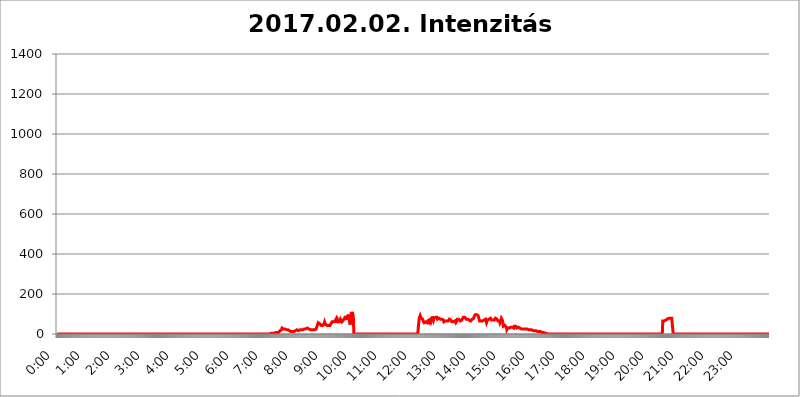
| Category | 2017.02.02. Intenzitás [W/m^2] |
|---|---|
| 0.0 | 0 |
| 0.0006944444444444445 | 0 |
| 0.001388888888888889 | 0 |
| 0.0020833333333333333 | 0 |
| 0.002777777777777778 | 0 |
| 0.003472222222222222 | 0 |
| 0.004166666666666667 | 0 |
| 0.004861111111111111 | 0 |
| 0.005555555555555556 | 0 |
| 0.0062499999999999995 | 0 |
| 0.006944444444444444 | 0 |
| 0.007638888888888889 | 0 |
| 0.008333333333333333 | 0 |
| 0.009027777777777779 | 0 |
| 0.009722222222222222 | 0 |
| 0.010416666666666666 | 0 |
| 0.011111111111111112 | 0 |
| 0.011805555555555555 | 0 |
| 0.012499999999999999 | 0 |
| 0.013194444444444444 | 0 |
| 0.013888888888888888 | 0 |
| 0.014583333333333332 | 0 |
| 0.015277777777777777 | 0 |
| 0.015972222222222224 | 0 |
| 0.016666666666666666 | 0 |
| 0.017361111111111112 | 0 |
| 0.018055555555555557 | 0 |
| 0.01875 | 0 |
| 0.019444444444444445 | 0 |
| 0.02013888888888889 | 0 |
| 0.020833333333333332 | 0 |
| 0.02152777777777778 | 0 |
| 0.022222222222222223 | 0 |
| 0.02291666666666667 | 0 |
| 0.02361111111111111 | 0 |
| 0.024305555555555556 | 0 |
| 0.024999999999999998 | 0 |
| 0.025694444444444447 | 0 |
| 0.02638888888888889 | 0 |
| 0.027083333333333334 | 0 |
| 0.027777777777777776 | 0 |
| 0.02847222222222222 | 0 |
| 0.029166666666666664 | 0 |
| 0.029861111111111113 | 0 |
| 0.030555555555555555 | 0 |
| 0.03125 | 0 |
| 0.03194444444444445 | 0 |
| 0.03263888888888889 | 0 |
| 0.03333333333333333 | 0 |
| 0.034027777777777775 | 0 |
| 0.034722222222222224 | 0 |
| 0.035416666666666666 | 0 |
| 0.036111111111111115 | 0 |
| 0.03680555555555556 | 0 |
| 0.0375 | 0 |
| 0.03819444444444444 | 0 |
| 0.03888888888888889 | 0 |
| 0.03958333333333333 | 0 |
| 0.04027777777777778 | 0 |
| 0.04097222222222222 | 0 |
| 0.041666666666666664 | 0 |
| 0.042361111111111106 | 0 |
| 0.04305555555555556 | 0 |
| 0.043750000000000004 | 0 |
| 0.044444444444444446 | 0 |
| 0.04513888888888889 | 0 |
| 0.04583333333333334 | 0 |
| 0.04652777777777778 | 0 |
| 0.04722222222222222 | 0 |
| 0.04791666666666666 | 0 |
| 0.04861111111111111 | 0 |
| 0.049305555555555554 | 0 |
| 0.049999999999999996 | 0 |
| 0.05069444444444445 | 0 |
| 0.051388888888888894 | 0 |
| 0.052083333333333336 | 0 |
| 0.05277777777777778 | 0 |
| 0.05347222222222222 | 0 |
| 0.05416666666666667 | 0 |
| 0.05486111111111111 | 0 |
| 0.05555555555555555 | 0 |
| 0.05625 | 0 |
| 0.05694444444444444 | 0 |
| 0.057638888888888885 | 0 |
| 0.05833333333333333 | 0 |
| 0.05902777777777778 | 0 |
| 0.059722222222222225 | 0 |
| 0.06041666666666667 | 0 |
| 0.061111111111111116 | 0 |
| 0.06180555555555556 | 0 |
| 0.0625 | 0 |
| 0.06319444444444444 | 0 |
| 0.06388888888888888 | 0 |
| 0.06458333333333334 | 0 |
| 0.06527777777777778 | 0 |
| 0.06597222222222222 | 0 |
| 0.06666666666666667 | 0 |
| 0.06736111111111111 | 0 |
| 0.06805555555555555 | 0 |
| 0.06874999999999999 | 0 |
| 0.06944444444444443 | 0 |
| 0.07013888888888889 | 0 |
| 0.07083333333333333 | 0 |
| 0.07152777777777779 | 0 |
| 0.07222222222222223 | 0 |
| 0.07291666666666667 | 0 |
| 0.07361111111111111 | 0 |
| 0.07430555555555556 | 0 |
| 0.075 | 0 |
| 0.07569444444444444 | 0 |
| 0.0763888888888889 | 0 |
| 0.07708333333333334 | 0 |
| 0.07777777777777778 | 0 |
| 0.07847222222222222 | 0 |
| 0.07916666666666666 | 0 |
| 0.0798611111111111 | 0 |
| 0.08055555555555556 | 0 |
| 0.08125 | 0 |
| 0.08194444444444444 | 0 |
| 0.08263888888888889 | 0 |
| 0.08333333333333333 | 0 |
| 0.08402777777777777 | 0 |
| 0.08472222222222221 | 0 |
| 0.08541666666666665 | 0 |
| 0.08611111111111112 | 0 |
| 0.08680555555555557 | 0 |
| 0.08750000000000001 | 0 |
| 0.08819444444444445 | 0 |
| 0.08888888888888889 | 0 |
| 0.08958333333333333 | 0 |
| 0.09027777777777778 | 0 |
| 0.09097222222222222 | 0 |
| 0.09166666666666667 | 0 |
| 0.09236111111111112 | 0 |
| 0.09305555555555556 | 0 |
| 0.09375 | 0 |
| 0.09444444444444444 | 0 |
| 0.09513888888888888 | 0 |
| 0.09583333333333333 | 0 |
| 0.09652777777777777 | 0 |
| 0.09722222222222222 | 0 |
| 0.09791666666666667 | 0 |
| 0.09861111111111111 | 0 |
| 0.09930555555555555 | 0 |
| 0.09999999999999999 | 0 |
| 0.10069444444444443 | 0 |
| 0.1013888888888889 | 0 |
| 0.10208333333333335 | 0 |
| 0.10277777777777779 | 0 |
| 0.10347222222222223 | 0 |
| 0.10416666666666667 | 0 |
| 0.10486111111111111 | 0 |
| 0.10555555555555556 | 0 |
| 0.10625 | 0 |
| 0.10694444444444444 | 0 |
| 0.1076388888888889 | 0 |
| 0.10833333333333334 | 0 |
| 0.10902777777777778 | 0 |
| 0.10972222222222222 | 0 |
| 0.1111111111111111 | 0 |
| 0.11180555555555556 | 0 |
| 0.11180555555555556 | 0 |
| 0.1125 | 0 |
| 0.11319444444444444 | 0 |
| 0.11388888888888889 | 0 |
| 0.11458333333333333 | 0 |
| 0.11527777777777777 | 0 |
| 0.11597222222222221 | 0 |
| 0.11666666666666665 | 0 |
| 0.1173611111111111 | 0 |
| 0.11805555555555557 | 0 |
| 0.11944444444444445 | 0 |
| 0.12013888888888889 | 0 |
| 0.12083333333333333 | 0 |
| 0.12152777777777778 | 0 |
| 0.12222222222222223 | 0 |
| 0.12291666666666667 | 0 |
| 0.12291666666666667 | 0 |
| 0.12361111111111112 | 0 |
| 0.12430555555555556 | 0 |
| 0.125 | 0 |
| 0.12569444444444444 | 0 |
| 0.12638888888888888 | 0 |
| 0.12708333333333333 | 0 |
| 0.16875 | 0 |
| 0.12847222222222224 | 0 |
| 0.12916666666666668 | 0 |
| 0.12986111111111112 | 0 |
| 0.13055555555555556 | 0 |
| 0.13125 | 0 |
| 0.13194444444444445 | 0 |
| 0.1326388888888889 | 0 |
| 0.13333333333333333 | 0 |
| 0.13402777777777777 | 0 |
| 0.13402777777777777 | 0 |
| 0.13472222222222222 | 0 |
| 0.13541666666666666 | 0 |
| 0.1361111111111111 | 0 |
| 0.13749999999999998 | 0 |
| 0.13819444444444443 | 0 |
| 0.1388888888888889 | 0 |
| 0.13958333333333334 | 0 |
| 0.14027777777777778 | 0 |
| 0.14097222222222222 | 0 |
| 0.14166666666666666 | 0 |
| 0.1423611111111111 | 0 |
| 0.14305555555555557 | 0 |
| 0.14375000000000002 | 0 |
| 0.14444444444444446 | 0 |
| 0.1451388888888889 | 0 |
| 0.1451388888888889 | 0 |
| 0.14652777777777778 | 0 |
| 0.14722222222222223 | 0 |
| 0.14791666666666667 | 0 |
| 0.1486111111111111 | 0 |
| 0.14930555555555555 | 0 |
| 0.15 | 0 |
| 0.15069444444444444 | 0 |
| 0.15138888888888888 | 0 |
| 0.15208333333333332 | 0 |
| 0.15277777777777776 | 0 |
| 0.15347222222222223 | 0 |
| 0.15416666666666667 | 0 |
| 0.15486111111111112 | 0 |
| 0.15555555555555556 | 0 |
| 0.15625 | 0 |
| 0.15694444444444444 | 0 |
| 0.15763888888888888 | 0 |
| 0.15833333333333333 | 0 |
| 0.15902777777777777 | 0 |
| 0.15972222222222224 | 0 |
| 0.16041666666666668 | 0 |
| 0.16111111111111112 | 0 |
| 0.16180555555555556 | 0 |
| 0.1625 | 0 |
| 0.16319444444444445 | 0 |
| 0.1638888888888889 | 0 |
| 0.16458333333333333 | 0 |
| 0.16527777777777777 | 0 |
| 0.16597222222222222 | 0 |
| 0.16666666666666666 | 0 |
| 0.1673611111111111 | 0 |
| 0.16805555555555554 | 0 |
| 0.16874999999999998 | 0 |
| 0.16944444444444443 | 0 |
| 0.17013888888888887 | 0 |
| 0.1708333333333333 | 0 |
| 0.17152777777777775 | 0 |
| 0.17222222222222225 | 0 |
| 0.1729166666666667 | 0 |
| 0.17361111111111113 | 0 |
| 0.17430555555555557 | 0 |
| 0.17500000000000002 | 0 |
| 0.17569444444444446 | 0 |
| 0.1763888888888889 | 0 |
| 0.17708333333333334 | 0 |
| 0.17777777777777778 | 0 |
| 0.17847222222222223 | 0 |
| 0.17916666666666667 | 0 |
| 0.1798611111111111 | 0 |
| 0.18055555555555555 | 0 |
| 0.18125 | 0 |
| 0.18194444444444444 | 0 |
| 0.1826388888888889 | 0 |
| 0.18333333333333335 | 0 |
| 0.1840277777777778 | 0 |
| 0.18472222222222223 | 0 |
| 0.18541666666666667 | 0 |
| 0.18611111111111112 | 0 |
| 0.18680555555555556 | 0 |
| 0.1875 | 0 |
| 0.18819444444444444 | 0 |
| 0.18888888888888888 | 0 |
| 0.18958333333333333 | 0 |
| 0.19027777777777777 | 0 |
| 0.1909722222222222 | 0 |
| 0.19166666666666665 | 0 |
| 0.19236111111111112 | 0 |
| 0.19305555555555554 | 0 |
| 0.19375 | 0 |
| 0.19444444444444445 | 0 |
| 0.1951388888888889 | 0 |
| 0.19583333333333333 | 0 |
| 0.19652777777777777 | 0 |
| 0.19722222222222222 | 0 |
| 0.19791666666666666 | 0 |
| 0.1986111111111111 | 0 |
| 0.19930555555555554 | 0 |
| 0.19999999999999998 | 0 |
| 0.20069444444444443 | 0 |
| 0.20138888888888887 | 0 |
| 0.2020833333333333 | 0 |
| 0.2027777777777778 | 0 |
| 0.2034722222222222 | 0 |
| 0.2041666666666667 | 0 |
| 0.20486111111111113 | 0 |
| 0.20555555555555557 | 0 |
| 0.20625000000000002 | 0 |
| 0.20694444444444446 | 0 |
| 0.2076388888888889 | 0 |
| 0.20833333333333334 | 0 |
| 0.20902777777777778 | 0 |
| 0.20972222222222223 | 0 |
| 0.21041666666666667 | 0 |
| 0.2111111111111111 | 0 |
| 0.21180555555555555 | 0 |
| 0.2125 | 0 |
| 0.21319444444444444 | 0 |
| 0.2138888888888889 | 0 |
| 0.21458333333333335 | 0 |
| 0.2152777777777778 | 0 |
| 0.21597222222222223 | 0 |
| 0.21666666666666667 | 0 |
| 0.21736111111111112 | 0 |
| 0.21805555555555556 | 0 |
| 0.21875 | 0 |
| 0.21944444444444444 | 0 |
| 0.22013888888888888 | 0 |
| 0.22083333333333333 | 0 |
| 0.22152777777777777 | 0 |
| 0.2222222222222222 | 0 |
| 0.22291666666666665 | 0 |
| 0.2236111111111111 | 0 |
| 0.22430555555555556 | 0 |
| 0.225 | 0 |
| 0.22569444444444445 | 0 |
| 0.2263888888888889 | 0 |
| 0.22708333333333333 | 0 |
| 0.22777777777777777 | 0 |
| 0.22847222222222222 | 0 |
| 0.22916666666666666 | 0 |
| 0.2298611111111111 | 0 |
| 0.23055555555555554 | 0 |
| 0.23124999999999998 | 0 |
| 0.23194444444444443 | 0 |
| 0.23263888888888887 | 0 |
| 0.2333333333333333 | 0 |
| 0.2340277777777778 | 0 |
| 0.2347222222222222 | 0 |
| 0.2354166666666667 | 0 |
| 0.23611111111111113 | 0 |
| 0.23680555555555557 | 0 |
| 0.23750000000000002 | 0 |
| 0.23819444444444446 | 0 |
| 0.2388888888888889 | 0 |
| 0.23958333333333334 | 0 |
| 0.24027777777777778 | 0 |
| 0.24097222222222223 | 0 |
| 0.24166666666666667 | 0 |
| 0.2423611111111111 | 0 |
| 0.24305555555555555 | 0 |
| 0.24375 | 0 |
| 0.24444444444444446 | 0 |
| 0.24513888888888888 | 0 |
| 0.24583333333333335 | 0 |
| 0.2465277777777778 | 0 |
| 0.24722222222222223 | 0 |
| 0.24791666666666667 | 0 |
| 0.24861111111111112 | 0 |
| 0.24930555555555556 | 0 |
| 0.25 | 0 |
| 0.25069444444444444 | 0 |
| 0.2513888888888889 | 0 |
| 0.2520833333333333 | 0 |
| 0.25277777777777777 | 0 |
| 0.2534722222222222 | 0 |
| 0.25416666666666665 | 0 |
| 0.2548611111111111 | 0 |
| 0.2555555555555556 | 0 |
| 0.25625000000000003 | 0 |
| 0.2569444444444445 | 0 |
| 0.2576388888888889 | 0 |
| 0.25833333333333336 | 0 |
| 0.2590277777777778 | 0 |
| 0.25972222222222224 | 0 |
| 0.2604166666666667 | 0 |
| 0.2611111111111111 | 0 |
| 0.26180555555555557 | 0 |
| 0.2625 | 0 |
| 0.26319444444444445 | 0 |
| 0.2638888888888889 | 0 |
| 0.26458333333333334 | 0 |
| 0.2652777777777778 | 0 |
| 0.2659722222222222 | 0 |
| 0.26666666666666666 | 0 |
| 0.2673611111111111 | 0 |
| 0.26805555555555555 | 0 |
| 0.26875 | 0 |
| 0.26944444444444443 | 0 |
| 0.2701388888888889 | 0 |
| 0.2708333333333333 | 0 |
| 0.27152777777777776 | 0 |
| 0.2722222222222222 | 0 |
| 0.27291666666666664 | 0 |
| 0.2736111111111111 | 0 |
| 0.2743055555555555 | 0 |
| 0.27499999999999997 | 0 |
| 0.27569444444444446 | 0 |
| 0.27638888888888885 | 0 |
| 0.27708333333333335 | 0 |
| 0.2777777777777778 | 0 |
| 0.27847222222222223 | 0 |
| 0.2791666666666667 | 0 |
| 0.2798611111111111 | 0 |
| 0.28055555555555556 | 0 |
| 0.28125 | 0 |
| 0.28194444444444444 | 0 |
| 0.2826388888888889 | 0 |
| 0.2833333333333333 | 0 |
| 0.28402777777777777 | 0 |
| 0.2847222222222222 | 0 |
| 0.28541666666666665 | 0 |
| 0.28611111111111115 | 0 |
| 0.28680555555555554 | 0 |
| 0.28750000000000003 | 0 |
| 0.2881944444444445 | 0 |
| 0.2888888888888889 | 0 |
| 0.28958333333333336 | 0 |
| 0.2902777777777778 | 0 |
| 0.29097222222222224 | 0 |
| 0.2916666666666667 | 0 |
| 0.2923611111111111 | 0 |
| 0.29305555555555557 | 0 |
| 0.29375 | 0 |
| 0.29444444444444445 | 0 |
| 0.2951388888888889 | 0 |
| 0.29583333333333334 | 0 |
| 0.2965277777777778 | 3.525 |
| 0.2972222222222222 | 0 |
| 0.29791666666666666 | 0 |
| 0.2986111111111111 | 3.525 |
| 0.29930555555555555 | 3.525 |
| 0.3 | 3.525 |
| 0.30069444444444443 | 3.525 |
| 0.3013888888888889 | 3.525 |
| 0.3020833333333333 | 3.525 |
| 0.30277777777777776 | 3.525 |
| 0.3034722222222222 | 3.525 |
| 0.30416666666666664 | 3.525 |
| 0.3048611111111111 | 3.525 |
| 0.3055555555555555 | 3.525 |
| 0.30624999999999997 | 7.887 |
| 0.3069444444444444 | 7.887 |
| 0.3076388888888889 | 7.887 |
| 0.30833333333333335 | 7.887 |
| 0.3090277777777778 | 7.887 |
| 0.30972222222222223 | 7.887 |
| 0.3104166666666667 | 7.887 |
| 0.3111111111111111 | 12.257 |
| 0.31180555555555556 | 12.257 |
| 0.3125 | 16.636 |
| 0.31319444444444444 | 16.636 |
| 0.3138888888888889 | 21.024 |
| 0.3145833333333333 | 21.024 |
| 0.31527777777777777 | 29.823 |
| 0.3159722222222222 | 29.823 |
| 0.31666666666666665 | 25.419 |
| 0.31736111111111115 | 25.419 |
| 0.31805555555555554 | 25.419 |
| 0.31875000000000003 | 25.419 |
| 0.3194444444444445 | 25.419 |
| 0.3201388888888889 | 21.024 |
| 0.32083333333333336 | 21.024 |
| 0.3215277777777778 | 21.024 |
| 0.32222222222222224 | 21.024 |
| 0.3229166666666667 | 21.024 |
| 0.3236111111111111 | 21.024 |
| 0.32430555555555557 | 16.636 |
| 0.325 | 16.636 |
| 0.32569444444444445 | 16.636 |
| 0.3263888888888889 | 12.257 |
| 0.32708333333333334 | 12.257 |
| 0.3277777777777778 | 12.257 |
| 0.3284722222222222 | 12.257 |
| 0.32916666666666666 | 12.257 |
| 0.3298611111111111 | 12.257 |
| 0.33055555555555555 | 12.257 |
| 0.33125 | 12.257 |
| 0.33194444444444443 | 12.257 |
| 0.3326388888888889 | 12.257 |
| 0.3333333333333333 | 12.257 |
| 0.3340277777777778 | 16.636 |
| 0.3347222222222222 | 16.636 |
| 0.3354166666666667 | 16.636 |
| 0.3361111111111111 | 21.024 |
| 0.3368055555555556 | 16.636 |
| 0.33749999999999997 | 16.636 |
| 0.33819444444444446 | 16.636 |
| 0.33888888888888885 | 16.636 |
| 0.33958333333333335 | 21.024 |
| 0.34027777777777773 | 21.024 |
| 0.34097222222222223 | 25.419 |
| 0.3416666666666666 | 21.024 |
| 0.3423611111111111 | 21.024 |
| 0.3430555555555555 | 21.024 |
| 0.34375 | 21.024 |
| 0.3444444444444445 | 21.024 |
| 0.3451388888888889 | 21.024 |
| 0.3458333333333334 | 21.024 |
| 0.34652777777777777 | 25.419 |
| 0.34722222222222227 | 25.419 |
| 0.34791666666666665 | 25.419 |
| 0.34861111111111115 | 25.419 |
| 0.34930555555555554 | 29.823 |
| 0.35000000000000003 | 29.823 |
| 0.3506944444444444 | 29.823 |
| 0.3513888888888889 | 25.419 |
| 0.3520833333333333 | 25.419 |
| 0.3527777777777778 | 25.419 |
| 0.3534722222222222 | 25.419 |
| 0.3541666666666667 | 21.024 |
| 0.3548611111111111 | 21.024 |
| 0.35555555555555557 | 21.024 |
| 0.35625 | 21.024 |
| 0.35694444444444445 | 21.024 |
| 0.3576388888888889 | 21.024 |
| 0.35833333333333334 | 21.024 |
| 0.3590277777777778 | 21.024 |
| 0.3597222222222222 | 21.024 |
| 0.36041666666666666 | 21.024 |
| 0.3611111111111111 | 21.024 |
| 0.36180555555555555 | 25.419 |
| 0.3625 | 25.419 |
| 0.36319444444444443 | 25.419 |
| 0.3638888888888889 | 34.234 |
| 0.3645833333333333 | 38.653 |
| 0.3652777777777778 | 38.653 |
| 0.3659722222222222 | 56.398 |
| 0.3666666666666667 | 51.951 |
| 0.3673611111111111 | 51.951 |
| 0.3680555555555556 | 51.951 |
| 0.36874999999999997 | 47.511 |
| 0.36944444444444446 | 51.951 |
| 0.37013888888888885 | 43.079 |
| 0.37083333333333335 | 47.511 |
| 0.37152777777777773 | 47.511 |
| 0.37222222222222223 | 43.079 |
| 0.3729166666666666 | 47.511 |
| 0.3736111111111111 | 47.511 |
| 0.3743055555555555 | 51.951 |
| 0.375 | 60.85 |
| 0.3756944444444445 | 56.398 |
| 0.3763888888888889 | 47.511 |
| 0.3770833333333334 | 43.079 |
| 0.37777777777777777 | 43.079 |
| 0.37847222222222227 | 43.079 |
| 0.37916666666666665 | 43.079 |
| 0.37986111111111115 | 43.079 |
| 0.38055555555555554 | 43.079 |
| 0.38125000000000003 | 47.511 |
| 0.3819444444444444 | 47.511 |
| 0.3826388888888889 | 43.079 |
| 0.3833333333333333 | 47.511 |
| 0.3840277777777778 | 51.951 |
| 0.3847222222222222 | 56.398 |
| 0.3854166666666667 | 60.85 |
| 0.3861111111111111 | 65.31 |
| 0.38680555555555557 | 65.31 |
| 0.3875 | 60.85 |
| 0.38819444444444445 | 56.398 |
| 0.3888888888888889 | 56.398 |
| 0.38958333333333334 | 65.31 |
| 0.3902777777777778 | 60.85 |
| 0.3909722222222222 | 74.246 |
| 0.39166666666666666 | 56.398 |
| 0.3923611111111111 | 51.951 |
| 0.39305555555555555 | 69.775 |
| 0.39375 | 60.85 |
| 0.39444444444444443 | 60.85 |
| 0.3951388888888889 | 60.85 |
| 0.3958333333333333 | 60.85 |
| 0.3965277777777778 | 65.31 |
| 0.3972222222222222 | 74.246 |
| 0.3979166666666667 | 74.246 |
| 0.3986111111111111 | 69.775 |
| 0.3993055555555556 | 60.85 |
| 0.39999999999999997 | 60.85 |
| 0.40069444444444446 | 65.31 |
| 0.40138888888888885 | 69.775 |
| 0.40208333333333335 | 74.246 |
| 0.40277777777777773 | 74.246 |
| 0.40347222222222223 | 83.205 |
| 0.4041666666666666 | 78.722 |
| 0.4048611111111111 | 87.692 |
| 0.4055555555555555 | 83.205 |
| 0.40625 | 69.775 |
| 0.4069444444444445 | 92.184 |
| 0.4076388888888889 | 78.722 |
| 0.4083333333333334 | 96.682 |
| 0.40902777777777777 | 92.184 |
| 0.40972222222222227 | 74.246 |
| 0.41041666666666665 | 47.511 |
| 0.41111111111111115 | 56.398 |
| 0.41180555555555554 | 83.205 |
| 0.41250000000000003 | 110.201 |
| 0.4131944444444444 | 92.184 |
| 0.4138888888888889 | 110.201 |
| 0.4145833333333333 | 96.682 |
| 0.4152777777777778 | 87.692 |
| 0.4159722222222222 | 0 |
| 0.4166666666666667 | 0 |
| 0.4173611111111111 | 0 |
| 0.41805555555555557 | 0 |
| 0.41875 | 0 |
| 0.41944444444444445 | 0 |
| 0.4201388888888889 | 0 |
| 0.42083333333333334 | 0 |
| 0.4215277777777778 | 0 |
| 0.4222222222222222 | 0 |
| 0.42291666666666666 | 0 |
| 0.4236111111111111 | 0 |
| 0.42430555555555555 | 0 |
| 0.425 | 0 |
| 0.42569444444444443 | 0 |
| 0.4263888888888889 | 0 |
| 0.4270833333333333 | 0 |
| 0.4277777777777778 | 0 |
| 0.4284722222222222 | 0 |
| 0.4291666666666667 | 0 |
| 0.4298611111111111 | 0 |
| 0.4305555555555556 | 0 |
| 0.43124999999999997 | 0 |
| 0.43194444444444446 | 0 |
| 0.43263888888888885 | 0 |
| 0.43333333333333335 | 0 |
| 0.43402777777777773 | 0 |
| 0.43472222222222223 | 0 |
| 0.4354166666666666 | 0 |
| 0.4361111111111111 | 0 |
| 0.4368055555555555 | 0 |
| 0.4375 | 0 |
| 0.4381944444444445 | 0 |
| 0.4388888888888889 | 0 |
| 0.4395833333333334 | 0 |
| 0.44027777777777777 | 0 |
| 0.44097222222222227 | 0 |
| 0.44166666666666665 | 0 |
| 0.44236111111111115 | 0 |
| 0.44305555555555554 | 0 |
| 0.44375000000000003 | 0 |
| 0.4444444444444444 | 0 |
| 0.4451388888888889 | 0 |
| 0.4458333333333333 | 0 |
| 0.4465277777777778 | 0 |
| 0.4472222222222222 | 0 |
| 0.4479166666666667 | 0 |
| 0.4486111111111111 | 0 |
| 0.44930555555555557 | 0 |
| 0.45 | 0 |
| 0.45069444444444445 | 0 |
| 0.4513888888888889 | 0 |
| 0.45208333333333334 | 0 |
| 0.4527777777777778 | 0 |
| 0.4534722222222222 | 0 |
| 0.45416666666666666 | 0 |
| 0.4548611111111111 | 0 |
| 0.45555555555555555 | 0 |
| 0.45625 | 0 |
| 0.45694444444444443 | 0 |
| 0.4576388888888889 | 0 |
| 0.4583333333333333 | 0 |
| 0.4590277777777778 | 0 |
| 0.4597222222222222 | 0 |
| 0.4604166666666667 | 0 |
| 0.4611111111111111 | 0 |
| 0.4618055555555556 | 0 |
| 0.46249999999999997 | 0 |
| 0.46319444444444446 | 0 |
| 0.46388888888888885 | 0 |
| 0.46458333333333335 | 0 |
| 0.46527777777777773 | 0 |
| 0.46597222222222223 | 0 |
| 0.4666666666666666 | 0 |
| 0.4673611111111111 | 0 |
| 0.4680555555555555 | 0 |
| 0.46875 | 0 |
| 0.4694444444444445 | 0 |
| 0.4701388888888889 | 0 |
| 0.4708333333333334 | 0 |
| 0.47152777777777777 | 0 |
| 0.47222222222222227 | 0 |
| 0.47291666666666665 | 0 |
| 0.47361111111111115 | 0 |
| 0.47430555555555554 | 0 |
| 0.47500000000000003 | 0 |
| 0.4756944444444444 | 0 |
| 0.4763888888888889 | 0 |
| 0.4770833333333333 | 0 |
| 0.4777777777777778 | 0 |
| 0.4784722222222222 | 0 |
| 0.4791666666666667 | 0 |
| 0.4798611111111111 | 0 |
| 0.48055555555555557 | 0 |
| 0.48125 | 0 |
| 0.48194444444444445 | 0 |
| 0.4826388888888889 | 0 |
| 0.48333333333333334 | 0 |
| 0.4840277777777778 | 0 |
| 0.4847222222222222 | 0 |
| 0.48541666666666666 | 0 |
| 0.4861111111111111 | 0 |
| 0.48680555555555555 | 0 |
| 0.4875 | 0 |
| 0.48819444444444443 | 0 |
| 0.4888888888888889 | 0 |
| 0.4895833333333333 | 0 |
| 0.4902777777777778 | 0 |
| 0.4909722222222222 | 0 |
| 0.4916666666666667 | 0 |
| 0.4923611111111111 | 0 |
| 0.4930555555555556 | 0 |
| 0.49374999999999997 | 0 |
| 0.49444444444444446 | 0 |
| 0.49513888888888885 | 0 |
| 0.49583333333333335 | 0 |
| 0.49652777777777773 | 0 |
| 0.49722222222222223 | 0 |
| 0.4979166666666666 | 0 |
| 0.4986111111111111 | 0 |
| 0.4993055555555555 | 0 |
| 0.5 | 0 |
| 0.5006944444444444 | 0 |
| 0.5013888888888889 | 0 |
| 0.5020833333333333 | 0 |
| 0.5027777777777778 | 0 |
| 0.5034722222222222 | 0 |
| 0.5041666666666667 | 0 |
| 0.5048611111111111 | 0 |
| 0.5055555555555555 | 0 |
| 0.50625 | 0 |
| 0.5069444444444444 | 0 |
| 0.5076388888888889 | 78.722 |
| 0.5083333333333333 | 78.722 |
| 0.5090277777777777 | 92.184 |
| 0.5097222222222222 | 87.692 |
| 0.5104166666666666 | 78.722 |
| 0.5111111111111112 | 74.246 |
| 0.5118055555555555 | 74.246 |
| 0.5125000000000001 | 74.246 |
| 0.5131944444444444 | 65.31 |
| 0.513888888888889 | 60.85 |
| 0.5145833333333333 | 56.398 |
| 0.5152777777777778 | 56.398 |
| 0.5159722222222222 | 56.398 |
| 0.5166666666666667 | 60.85 |
| 0.517361111111111 | 60.85 |
| 0.5180555555555556 | 60.85 |
| 0.5187499999999999 | 56.398 |
| 0.5194444444444445 | 65.31 |
| 0.5201388888888888 | 69.775 |
| 0.5208333333333334 | 65.31 |
| 0.5215277777777778 | 69.775 |
| 0.5222222222222223 | 60.85 |
| 0.5229166666666667 | 65.31 |
| 0.5236111111111111 | 69.775 |
| 0.5243055555555556 | 60.85 |
| 0.525 | 65.31 |
| 0.5256944444444445 | 74.246 |
| 0.5263888888888889 | 87.692 |
| 0.5270833333333333 | 78.722 |
| 0.5277777777777778 | 69.775 |
| 0.5284722222222222 | 78.722 |
| 0.5291666666666667 | 74.246 |
| 0.5298611111111111 | 83.205 |
| 0.5305555555555556 | 83.205 |
| 0.53125 | 83.205 |
| 0.5319444444444444 | 87.692 |
| 0.5326388888888889 | 83.205 |
| 0.5333333333333333 | 74.246 |
| 0.5340277777777778 | 74.246 |
| 0.5347222222222222 | 78.722 |
| 0.5354166666666667 | 78.722 |
| 0.5361111111111111 | 74.246 |
| 0.5368055555555555 | 74.246 |
| 0.5375 | 74.246 |
| 0.5381944444444444 | 69.775 |
| 0.5388888888888889 | 74.246 |
| 0.5395833333333333 | 74.246 |
| 0.5402777777777777 | 78.722 |
| 0.5409722222222222 | 74.246 |
| 0.5416666666666666 | 69.775 |
| 0.5423611111111112 | 60.85 |
| 0.5430555555555555 | 60.85 |
| 0.5437500000000001 | 65.31 |
| 0.5444444444444444 | 65.31 |
| 0.545138888888889 | 60.85 |
| 0.5458333333333333 | 65.31 |
| 0.5465277777777778 | 65.31 |
| 0.5472222222222222 | 60.85 |
| 0.5479166666666667 | 60.85 |
| 0.548611111111111 | 65.31 |
| 0.5493055555555556 | 65.31 |
| 0.5499999999999999 | 74.246 |
| 0.5506944444444445 | 74.246 |
| 0.5513888888888888 | 74.246 |
| 0.5520833333333334 | 69.775 |
| 0.5527777777777778 | 65.31 |
| 0.5534722222222223 | 60.85 |
| 0.5541666666666667 | 56.398 |
| 0.5548611111111111 | 56.398 |
| 0.5555555555555556 | 60.85 |
| 0.55625 | 60.85 |
| 0.5569444444444445 | 65.31 |
| 0.5576388888888889 | 65.31 |
| 0.5583333333333333 | 60.85 |
| 0.5590277777777778 | 56.398 |
| 0.5597222222222222 | 56.398 |
| 0.5604166666666667 | 65.31 |
| 0.5611111111111111 | 74.246 |
| 0.5618055555555556 | 74.246 |
| 0.5625 | 74.246 |
| 0.5631944444444444 | 74.246 |
| 0.5638888888888889 | 74.246 |
| 0.5645833333333333 | 69.775 |
| 0.5652777777777778 | 65.31 |
| 0.5659722222222222 | 65.31 |
| 0.5666666666666667 | 69.775 |
| 0.5673611111111111 | 69.775 |
| 0.5680555555555555 | 65.31 |
| 0.56875 | 74.246 |
| 0.5694444444444444 | 83.205 |
| 0.5701388888888889 | 78.722 |
| 0.5708333333333333 | 78.722 |
| 0.5715277777777777 | 83.205 |
| 0.5722222222222222 | 83.205 |
| 0.5729166666666666 | 83.205 |
| 0.5736111111111112 | 74.246 |
| 0.5743055555555555 | 74.246 |
| 0.5750000000000001 | 74.246 |
| 0.5756944444444444 | 74.246 |
| 0.576388888888889 | 74.246 |
| 0.5770833333333333 | 69.775 |
| 0.5777777777777778 | 69.775 |
| 0.5784722222222222 | 69.775 |
| 0.5791666666666667 | 65.31 |
| 0.579861111111111 | 65.31 |
| 0.5805555555555556 | 65.31 |
| 0.5812499999999999 | 69.775 |
| 0.5819444444444445 | 74.246 |
| 0.5826388888888888 | 74.246 |
| 0.5833333333333334 | 74.246 |
| 0.5840277777777778 | 78.722 |
| 0.5847222222222223 | 87.692 |
| 0.5854166666666667 | 92.184 |
| 0.5861111111111111 | 96.682 |
| 0.5868055555555556 | 96.682 |
| 0.5875 | 96.682 |
| 0.5881944444444445 | 96.682 |
| 0.5888888888888889 | 92.184 |
| 0.5895833333333333 | 92.184 |
| 0.5902777777777778 | 92.184 |
| 0.5909722222222222 | 87.692 |
| 0.5916666666666667 | 74.246 |
| 0.5923611111111111 | 65.31 |
| 0.5930555555555556 | 65.31 |
| 0.59375 | 60.85 |
| 0.5944444444444444 | 65.31 |
| 0.5951388888888889 | 65.31 |
| 0.5958333333333333 | 65.31 |
| 0.5965277777777778 | 65.31 |
| 0.5972222222222222 | 69.775 |
| 0.5979166666666667 | 69.775 |
| 0.5986111111111111 | 69.775 |
| 0.5993055555555555 | 69.775 |
| 0.6 | 74.246 |
| 0.6006944444444444 | 74.246 |
| 0.6013888888888889 | 65.31 |
| 0.6020833333333333 | 56.398 |
| 0.6027777777777777 | 60.85 |
| 0.6034722222222222 | 69.775 |
| 0.6041666666666666 | 74.246 |
| 0.6048611111111112 | 74.246 |
| 0.6055555555555555 | 74.246 |
| 0.6062500000000001 | 74.246 |
| 0.6069444444444444 | 78.722 |
| 0.607638888888889 | 78.722 |
| 0.6083333333333333 | 74.246 |
| 0.6090277777777778 | 69.775 |
| 0.6097222222222222 | 65.31 |
| 0.6104166666666667 | 69.775 |
| 0.611111111111111 | 69.775 |
| 0.6118055555555556 | 69.775 |
| 0.6124999999999999 | 69.775 |
| 0.6131944444444445 | 69.775 |
| 0.6138888888888888 | 74.246 |
| 0.6145833333333334 | 78.722 |
| 0.6152777777777778 | 78.722 |
| 0.6159722222222223 | 78.722 |
| 0.6166666666666667 | 74.246 |
| 0.6173611111111111 | 74.246 |
| 0.6180555555555556 | 65.31 |
| 0.61875 | 65.31 |
| 0.6194444444444445 | 69.775 |
| 0.6201388888888889 | 65.31 |
| 0.6208333333333333 | 56.398 |
| 0.6215277777777778 | 56.398 |
| 0.6222222222222222 | 69.775 |
| 0.6229166666666667 | 78.722 |
| 0.6236111111111111 | 74.246 |
| 0.6243055555555556 | 69.775 |
| 0.625 | 56.398 |
| 0.6256944444444444 | 38.653 |
| 0.6263888888888889 | 34.234 |
| 0.6270833333333333 | 38.653 |
| 0.6277777777777778 | 43.079 |
| 0.6284722222222222 | 38.653 |
| 0.6291666666666667 | 38.653 |
| 0.6298611111111111 | 34.234 |
| 0.6305555555555555 | 21.024 |
| 0.63125 | 21.024 |
| 0.6319444444444444 | 29.823 |
| 0.6326388888888889 | 29.823 |
| 0.6333333333333333 | 29.823 |
| 0.6340277777777777 | 29.823 |
| 0.6347222222222222 | 25.419 |
| 0.6354166666666666 | 29.823 |
| 0.6361111111111112 | 34.234 |
| 0.6368055555555555 | 38.653 |
| 0.6375000000000001 | 38.653 |
| 0.6381944444444444 | 34.234 |
| 0.638888888888889 | 29.823 |
| 0.6395833333333333 | 29.823 |
| 0.6402777777777778 | 29.823 |
| 0.6409722222222222 | 38.653 |
| 0.6416666666666667 | 38.653 |
| 0.642361111111111 | 38.653 |
| 0.6430555555555556 | 38.653 |
| 0.6437499999999999 | 34.234 |
| 0.6444444444444445 | 29.823 |
| 0.6451388888888888 | 29.823 |
| 0.6458333333333334 | 29.823 |
| 0.6465277777777778 | 34.234 |
| 0.6472222222222223 | 29.823 |
| 0.6479166666666667 | 29.823 |
| 0.6486111111111111 | 29.823 |
| 0.6493055555555556 | 29.823 |
| 0.65 | 25.419 |
| 0.6506944444444445 | 25.419 |
| 0.6513888888888889 | 25.419 |
| 0.6520833333333333 | 25.419 |
| 0.6527777777777778 | 25.419 |
| 0.6534722222222222 | 25.419 |
| 0.6541666666666667 | 25.419 |
| 0.6548611111111111 | 25.419 |
| 0.6555555555555556 | 25.419 |
| 0.65625 | 25.419 |
| 0.6569444444444444 | 25.419 |
| 0.6576388888888889 | 25.419 |
| 0.6583333333333333 | 25.419 |
| 0.6590277777777778 | 25.419 |
| 0.6597222222222222 | 25.419 |
| 0.6604166666666667 | 21.024 |
| 0.6611111111111111 | 21.024 |
| 0.6618055555555555 | 21.024 |
| 0.6625 | 21.024 |
| 0.6631944444444444 | 21.024 |
| 0.6638888888888889 | 21.024 |
| 0.6645833333333333 | 21.024 |
| 0.6652777777777777 | 21.024 |
| 0.6659722222222222 | 21.024 |
| 0.6666666666666666 | 16.636 |
| 0.6673611111111111 | 16.636 |
| 0.6680555555555556 | 16.636 |
| 0.6687500000000001 | 16.636 |
| 0.6694444444444444 | 16.636 |
| 0.6701388888888888 | 16.636 |
| 0.6708333333333334 | 16.636 |
| 0.6715277777777778 | 16.636 |
| 0.6722222222222222 | 16.636 |
| 0.6729166666666666 | 16.636 |
| 0.6736111111111112 | 12.257 |
| 0.6743055555555556 | 12.257 |
| 0.6749999999999999 | 12.257 |
| 0.6756944444444444 | 12.257 |
| 0.6763888888888889 | 12.257 |
| 0.6770833333333334 | 12.257 |
| 0.6777777777777777 | 12.257 |
| 0.6784722222222223 | 7.887 |
| 0.6791666666666667 | 7.887 |
| 0.6798611111111111 | 7.887 |
| 0.6805555555555555 | 7.887 |
| 0.68125 | 7.887 |
| 0.6819444444444445 | 7.887 |
| 0.6826388888888889 | 3.525 |
| 0.6833333333333332 | 3.525 |
| 0.6840277777777778 | 3.525 |
| 0.6847222222222222 | 3.525 |
| 0.6854166666666667 | 3.525 |
| 0.686111111111111 | 3.525 |
| 0.6868055555555556 | 3.525 |
| 0.6875 | 0 |
| 0.6881944444444444 | 0 |
| 0.688888888888889 | 0 |
| 0.6895833333333333 | 0 |
| 0.6902777777777778 | 0 |
| 0.6909722222222222 | 0 |
| 0.6916666666666668 | 0 |
| 0.6923611111111111 | 0 |
| 0.6930555555555555 | 0 |
| 0.69375 | 0 |
| 0.6944444444444445 | 0 |
| 0.6951388888888889 | 0 |
| 0.6958333333333333 | 0 |
| 0.6965277777777777 | 0 |
| 0.6972222222222223 | 0 |
| 0.6979166666666666 | 0 |
| 0.6986111111111111 | 0 |
| 0.6993055555555556 | 0 |
| 0.7000000000000001 | 0 |
| 0.7006944444444444 | 0 |
| 0.7013888888888888 | 0 |
| 0.7020833333333334 | 0 |
| 0.7027777777777778 | 0 |
| 0.7034722222222222 | 0 |
| 0.7041666666666666 | 0 |
| 0.7048611111111112 | 0 |
| 0.7055555555555556 | 0 |
| 0.7062499999999999 | 0 |
| 0.7069444444444444 | 0 |
| 0.7076388888888889 | 0 |
| 0.7083333333333334 | 0 |
| 0.7090277777777777 | 0 |
| 0.7097222222222223 | 0 |
| 0.7104166666666667 | 0 |
| 0.7111111111111111 | 0 |
| 0.7118055555555555 | 0 |
| 0.7125 | 0 |
| 0.7131944444444445 | 0 |
| 0.7138888888888889 | 0 |
| 0.7145833333333332 | 0 |
| 0.7152777777777778 | 0 |
| 0.7159722222222222 | 0 |
| 0.7166666666666667 | 0 |
| 0.717361111111111 | 0 |
| 0.7180555555555556 | 0 |
| 0.71875 | 0 |
| 0.7194444444444444 | 0 |
| 0.720138888888889 | 0 |
| 0.7208333333333333 | 0 |
| 0.7215277777777778 | 0 |
| 0.7222222222222222 | 0 |
| 0.7229166666666668 | 0 |
| 0.7236111111111111 | 0 |
| 0.7243055555555555 | 0 |
| 0.725 | 0 |
| 0.7256944444444445 | 0 |
| 0.7263888888888889 | 0 |
| 0.7270833333333333 | 0 |
| 0.7277777777777777 | 0 |
| 0.7284722222222223 | 0 |
| 0.7291666666666666 | 0 |
| 0.7298611111111111 | 0 |
| 0.7305555555555556 | 0 |
| 0.7312500000000001 | 0 |
| 0.7319444444444444 | 0 |
| 0.7326388888888888 | 0 |
| 0.7333333333333334 | 0 |
| 0.7340277777777778 | 0 |
| 0.7347222222222222 | 0 |
| 0.7354166666666666 | 0 |
| 0.7361111111111112 | 0 |
| 0.7368055555555556 | 0 |
| 0.7374999999999999 | 0 |
| 0.7381944444444444 | 0 |
| 0.7388888888888889 | 0 |
| 0.7395833333333334 | 0 |
| 0.7402777777777777 | 0 |
| 0.7409722222222223 | 0 |
| 0.7416666666666667 | 0 |
| 0.7423611111111111 | 0 |
| 0.7430555555555555 | 0 |
| 0.74375 | 0 |
| 0.7444444444444445 | 0 |
| 0.7451388888888889 | 0 |
| 0.7458333333333332 | 0 |
| 0.7465277777777778 | 0 |
| 0.7472222222222222 | 0 |
| 0.7479166666666667 | 0 |
| 0.748611111111111 | 0 |
| 0.7493055555555556 | 0 |
| 0.75 | 0 |
| 0.7506944444444444 | 0 |
| 0.751388888888889 | 0 |
| 0.7520833333333333 | 0 |
| 0.7527777777777778 | 0 |
| 0.7534722222222222 | 0 |
| 0.7541666666666668 | 0 |
| 0.7548611111111111 | 0 |
| 0.7555555555555555 | 0 |
| 0.75625 | 0 |
| 0.7569444444444445 | 0 |
| 0.7576388888888889 | 0 |
| 0.7583333333333333 | 0 |
| 0.7590277777777777 | 0 |
| 0.7597222222222223 | 0 |
| 0.7604166666666666 | 0 |
| 0.7611111111111111 | 0 |
| 0.7618055555555556 | 0 |
| 0.7625000000000001 | 0 |
| 0.7631944444444444 | 0 |
| 0.7638888888888888 | 0 |
| 0.7645833333333334 | 0 |
| 0.7652777777777778 | 0 |
| 0.7659722222222222 | 0 |
| 0.7666666666666666 | 0 |
| 0.7673611111111112 | 0 |
| 0.7680555555555556 | 0 |
| 0.7687499999999999 | 0 |
| 0.7694444444444444 | 0 |
| 0.7701388888888889 | 0 |
| 0.7708333333333334 | 0 |
| 0.7715277777777777 | 0 |
| 0.7722222222222223 | 0 |
| 0.7729166666666667 | 0 |
| 0.7736111111111111 | 0 |
| 0.7743055555555555 | 0 |
| 0.775 | 0 |
| 0.7756944444444445 | 0 |
| 0.7763888888888889 | 0 |
| 0.7770833333333332 | 0 |
| 0.7777777777777778 | 0 |
| 0.7784722222222222 | 0 |
| 0.7791666666666667 | 0 |
| 0.779861111111111 | 0 |
| 0.7805555555555556 | 0 |
| 0.78125 | 0 |
| 0.7819444444444444 | 0 |
| 0.782638888888889 | 0 |
| 0.7833333333333333 | 0 |
| 0.7840277777777778 | 0 |
| 0.7847222222222222 | 0 |
| 0.7854166666666668 | 0 |
| 0.7861111111111111 | 0 |
| 0.7868055555555555 | 0 |
| 0.7875 | 0 |
| 0.7881944444444445 | 0 |
| 0.7888888888888889 | 0 |
| 0.7895833333333333 | 0 |
| 0.7902777777777777 | 0 |
| 0.7909722222222223 | 0 |
| 0.7916666666666666 | 0 |
| 0.7923611111111111 | 0 |
| 0.7930555555555556 | 0 |
| 0.7937500000000001 | 0 |
| 0.7944444444444444 | 0 |
| 0.7951388888888888 | 0 |
| 0.7958333333333334 | 0 |
| 0.7965277777777778 | 0 |
| 0.7972222222222222 | 0 |
| 0.7979166666666666 | 0 |
| 0.7986111111111112 | 0 |
| 0.7993055555555556 | 0 |
| 0.7999999999999999 | 0 |
| 0.8006944444444444 | 0 |
| 0.8013888888888889 | 0 |
| 0.8020833333333334 | 0 |
| 0.8027777777777777 | 0 |
| 0.8034722222222223 | 0 |
| 0.8041666666666667 | 0 |
| 0.8048611111111111 | 0 |
| 0.8055555555555555 | 0 |
| 0.80625 | 0 |
| 0.8069444444444445 | 0 |
| 0.8076388888888889 | 0 |
| 0.8083333333333332 | 0 |
| 0.8090277777777778 | 0 |
| 0.8097222222222222 | 0 |
| 0.8104166666666667 | 0 |
| 0.811111111111111 | 0 |
| 0.8118055555555556 | 0 |
| 0.8125 | 0 |
| 0.8131944444444444 | 0 |
| 0.813888888888889 | 0 |
| 0.8145833333333333 | 0 |
| 0.8152777777777778 | 0 |
| 0.8159722222222222 | 0 |
| 0.8166666666666668 | 0 |
| 0.8173611111111111 | 0 |
| 0.8180555555555555 | 0 |
| 0.81875 | 0 |
| 0.8194444444444445 | 0 |
| 0.8201388888888889 | 0 |
| 0.8208333333333333 | 0 |
| 0.8215277777777777 | 0 |
| 0.8222222222222223 | 0 |
| 0.8229166666666666 | 0 |
| 0.8236111111111111 | 0 |
| 0.8243055555555556 | 0 |
| 0.8250000000000001 | 0 |
| 0.8256944444444444 | 0 |
| 0.8263888888888888 | 0 |
| 0.8270833333333334 | 0 |
| 0.8277777777777778 | 0 |
| 0.8284722222222222 | 0 |
| 0.8291666666666666 | 0 |
| 0.8298611111111112 | 0 |
| 0.8305555555555556 | 0 |
| 0.8312499999999999 | 0 |
| 0.8319444444444444 | 0 |
| 0.8326388888888889 | 0 |
| 0.8333333333333334 | 0 |
| 0.8340277777777777 | 0 |
| 0.8347222222222223 | 0 |
| 0.8354166666666667 | 0 |
| 0.8361111111111111 | 0 |
| 0.8368055555555555 | 0 |
| 0.8375 | 0 |
| 0.8381944444444445 | 0 |
| 0.8388888888888889 | 0 |
| 0.8395833333333332 | 0 |
| 0.8402777777777778 | 0 |
| 0.8409722222222222 | 0 |
| 0.8416666666666667 | 0 |
| 0.842361111111111 | 0 |
| 0.8430555555555556 | 0 |
| 0.84375 | 0 |
| 0.8444444444444444 | 0 |
| 0.845138888888889 | 0 |
| 0.8458333333333333 | 0 |
| 0.8465277777777778 | 0 |
| 0.8472222222222222 | 0 |
| 0.8479166666666668 | 0 |
| 0.8486111111111111 | 0 |
| 0.8493055555555555 | 65.31 |
| 0.85 | 65.31 |
| 0.8506944444444445 | 65.31 |
| 0.8513888888888889 | 65.31 |
| 0.8520833333333333 | 65.31 |
| 0.8527777777777777 | 65.31 |
| 0.8534722222222223 | 69.775 |
| 0.8541666666666666 | 69.775 |
| 0.8548611111111111 | 74.246 |
| 0.8555555555555556 | 74.246 |
| 0.8562500000000001 | 74.246 |
| 0.8569444444444444 | 74.246 |
| 0.8576388888888888 | 78.722 |
| 0.8583333333333334 | 78.722 |
| 0.8590277777777778 | 78.722 |
| 0.8597222222222222 | 78.722 |
| 0.8604166666666666 | 78.722 |
| 0.8611111111111112 | 78.722 |
| 0.8618055555555556 | 78.722 |
| 0.8624999999999999 | 78.722 |
| 0.8631944444444444 | 83.205 |
| 0.8638888888888889 | 0 |
| 0.8645833333333334 | 0 |
| 0.8652777777777777 | 0 |
| 0.8659722222222223 | 0 |
| 0.8666666666666667 | 0 |
| 0.8673611111111111 | 0 |
| 0.8680555555555555 | 0 |
| 0.86875 | 0 |
| 0.8694444444444445 | 0 |
| 0.8701388888888889 | 0 |
| 0.8708333333333332 | 0 |
| 0.8715277777777778 | 0 |
| 0.8722222222222222 | 0 |
| 0.8729166666666667 | 0 |
| 0.873611111111111 | 0 |
| 0.8743055555555556 | 0 |
| 0.875 | 0 |
| 0.8756944444444444 | 0 |
| 0.876388888888889 | 0 |
| 0.8770833333333333 | 0 |
| 0.8777777777777778 | 0 |
| 0.8784722222222222 | 0 |
| 0.8791666666666668 | 0 |
| 0.8798611111111111 | 0 |
| 0.8805555555555555 | 0 |
| 0.88125 | 0 |
| 0.8819444444444445 | 0 |
| 0.8826388888888889 | 0 |
| 0.8833333333333333 | 0 |
| 0.8840277777777777 | 0 |
| 0.8847222222222223 | 0 |
| 0.8854166666666666 | 0 |
| 0.8861111111111111 | 0 |
| 0.8868055555555556 | 0 |
| 0.8875000000000001 | 0 |
| 0.8881944444444444 | 0 |
| 0.8888888888888888 | 0 |
| 0.8895833333333334 | 0 |
| 0.8902777777777778 | 0 |
| 0.8909722222222222 | 0 |
| 0.8916666666666666 | 0 |
| 0.8923611111111112 | 0 |
| 0.8930555555555556 | 0 |
| 0.8937499999999999 | 0 |
| 0.8944444444444444 | 0 |
| 0.8951388888888889 | 0 |
| 0.8958333333333334 | 0 |
| 0.8965277777777777 | 0 |
| 0.8972222222222223 | 0 |
| 0.8979166666666667 | 0 |
| 0.8986111111111111 | 0 |
| 0.8993055555555555 | 0 |
| 0.9 | 0 |
| 0.9006944444444445 | 0 |
| 0.9013888888888889 | 0 |
| 0.9020833333333332 | 0 |
| 0.9027777777777778 | 0 |
| 0.9034722222222222 | 0 |
| 0.9041666666666667 | 0 |
| 0.904861111111111 | 0 |
| 0.9055555555555556 | 0 |
| 0.90625 | 0 |
| 0.9069444444444444 | 0 |
| 0.907638888888889 | 0 |
| 0.9083333333333333 | 0 |
| 0.9090277777777778 | 0 |
| 0.9097222222222222 | 0 |
| 0.9104166666666668 | 0 |
| 0.9111111111111111 | 0 |
| 0.9118055555555555 | 0 |
| 0.9125 | 0 |
| 0.9131944444444445 | 0 |
| 0.9138888888888889 | 0 |
| 0.9145833333333333 | 0 |
| 0.9152777777777777 | 0 |
| 0.9159722222222223 | 0 |
| 0.9166666666666666 | 0 |
| 0.9173611111111111 | 0 |
| 0.9180555555555556 | 0 |
| 0.9187500000000001 | 0 |
| 0.9194444444444444 | 0 |
| 0.9201388888888888 | 0 |
| 0.9208333333333334 | 0 |
| 0.9215277777777778 | 0 |
| 0.9222222222222222 | 0 |
| 0.9229166666666666 | 0 |
| 0.9236111111111112 | 0 |
| 0.9243055555555556 | 0 |
| 0.9249999999999999 | 0 |
| 0.9256944444444444 | 0 |
| 0.9263888888888889 | 0 |
| 0.9270833333333334 | 0 |
| 0.9277777777777777 | 0 |
| 0.9284722222222223 | 0 |
| 0.9291666666666667 | 0 |
| 0.9298611111111111 | 0 |
| 0.9305555555555555 | 0 |
| 0.93125 | 0 |
| 0.9319444444444445 | 0 |
| 0.9326388888888889 | 0 |
| 0.9333333333333332 | 0 |
| 0.9340277777777778 | 0 |
| 0.9347222222222222 | 0 |
| 0.9354166666666667 | 0 |
| 0.936111111111111 | 0 |
| 0.9368055555555556 | 0 |
| 0.9375 | 0 |
| 0.9381944444444444 | 0 |
| 0.938888888888889 | 0 |
| 0.9395833333333333 | 0 |
| 0.9402777777777778 | 0 |
| 0.9409722222222222 | 0 |
| 0.9416666666666668 | 0 |
| 0.9423611111111111 | 0 |
| 0.9430555555555555 | 0 |
| 0.94375 | 0 |
| 0.9444444444444445 | 0 |
| 0.9451388888888889 | 0 |
| 0.9458333333333333 | 0 |
| 0.9465277777777777 | 0 |
| 0.9472222222222223 | 0 |
| 0.9479166666666666 | 0 |
| 0.9486111111111111 | 0 |
| 0.9493055555555556 | 0 |
| 0.9500000000000001 | 0 |
| 0.9506944444444444 | 0 |
| 0.9513888888888888 | 0 |
| 0.9520833333333334 | 0 |
| 0.9527777777777778 | 0 |
| 0.9534722222222222 | 0 |
| 0.9541666666666666 | 0 |
| 0.9548611111111112 | 0 |
| 0.9555555555555556 | 0 |
| 0.9562499999999999 | 0 |
| 0.9569444444444444 | 0 |
| 0.9576388888888889 | 0 |
| 0.9583333333333334 | 0 |
| 0.9590277777777777 | 0 |
| 0.9597222222222223 | 0 |
| 0.9604166666666667 | 0 |
| 0.9611111111111111 | 0 |
| 0.9618055555555555 | 0 |
| 0.9625 | 0 |
| 0.9631944444444445 | 0 |
| 0.9638888888888889 | 0 |
| 0.9645833333333332 | 0 |
| 0.9652777777777778 | 0 |
| 0.9659722222222222 | 0 |
| 0.9666666666666667 | 0 |
| 0.967361111111111 | 0 |
| 0.9680555555555556 | 0 |
| 0.96875 | 0 |
| 0.9694444444444444 | 0 |
| 0.970138888888889 | 0 |
| 0.9708333333333333 | 0 |
| 0.9715277777777778 | 0 |
| 0.9722222222222222 | 0 |
| 0.9729166666666668 | 0 |
| 0.9736111111111111 | 0 |
| 0.9743055555555555 | 0 |
| 0.975 | 0 |
| 0.9756944444444445 | 0 |
| 0.9763888888888889 | 0 |
| 0.9770833333333333 | 0 |
| 0.9777777777777777 | 0 |
| 0.9784722222222223 | 0 |
| 0.9791666666666666 | 0 |
| 0.9798611111111111 | 0 |
| 0.9805555555555556 | 0 |
| 0.9812500000000001 | 0 |
| 0.9819444444444444 | 0 |
| 0.9826388888888888 | 0 |
| 0.9833333333333334 | 0 |
| 0.9840277777777778 | 0 |
| 0.9847222222222222 | 0 |
| 0.9854166666666666 | 0 |
| 0.9861111111111112 | 0 |
| 0.9868055555555556 | 0 |
| 0.9874999999999999 | 0 |
| 0.9881944444444444 | 0 |
| 0.9888888888888889 | 0 |
| 0.9895833333333334 | 0 |
| 0.9902777777777777 | 0 |
| 0.9909722222222223 | 0 |
| 0.9916666666666667 | 0 |
| 0.9923611111111111 | 0 |
| 0.9930555555555555 | 0 |
| 0.99375 | 0 |
| 0.9944444444444445 | 0 |
| 0.9951388888888889 | 0 |
| 0.9958333333333332 | 0 |
| 0.9965277777777778 | 0 |
| 0.9972222222222222 | 0 |
| 0.9979166666666667 | 0 |
| 0.998611111111111 | 0 |
| 0.9993055555555556 | 0 |